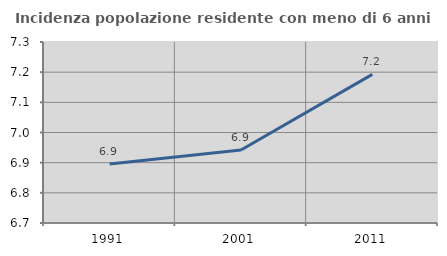
| Category | Incidenza popolazione residente con meno di 6 anni |
|---|---|
| 1991.0 | 6.895 |
| 2001.0 | 6.942 |
| 2011.0 | 7.193 |